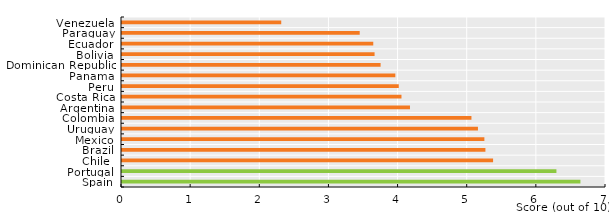
| Category | Series 0 |
|---|---|
| Spain | 6.63 |
| Portugal | 6.283 |
| Chile  | 5.367 |
| Brazil | 5.256 |
| Mexico | 5.241 |
| Uruguay | 5.148 |
| Colombia | 5.054 |
| Argentina | 4.165 |
| Costa Rica | 4.042 |
| Peru | 4.003 |
| Panama | 3.953 |
| Dominican Republic | 3.74 |
| Bolivia | 3.653 |
| Ecuador | 3.634 |
| Paraguay | 3.438 |
| Venezuela | 2.303 |